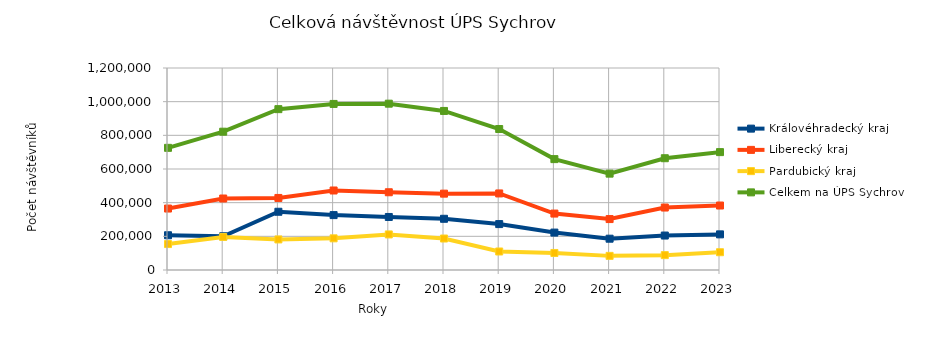
| Category | Královéhradecký kraj | Liberecký kraj | Pardubický kraj | Celkem na ÚPS Sychrov |
|---|---|---|---|---|
| 2013.0 | 206419 | 365108 | 154165 | 725692 |
| 2014.0 | 200438 | 424718 | 196473 | 821629 |
| 2015.0 | 345970 | 428023 | 181567 | 955560 |
| 2016.0 | 326137 | 472318 | 188108 | 986563 |
| 2017.0 | 314983 | 461803 | 211268 | 988054 |
| 2018.0 | 304267 | 453568 | 187017 | 944852 |
| 2019.0 | 272720 | 454785 | 109949 | 837454 |
| 2020.0 | 222238 | 335261 | 101211 | 658710 |
| 2021.0 | 185934 | 302574 | 83925 | 572433 |
| 2022.0 | 204678 | 371041 | 88282 | 664001 |
| 2023.0 | 211717 | 383004 | 105549 | 700270 |